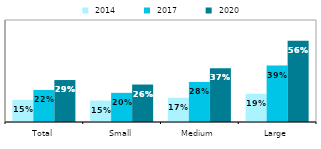
| Category |  2014 |  2017 |  2020 |
|---|---|---|---|
| Total | 0.152 | 0.22 | 0.288 |
| Small | 0.147 | 0.2 | 0.257 |
| Medium | 0.166 | 0.275 | 0.369 |
| Large | 0.194 | 0.387 | 0.557 |